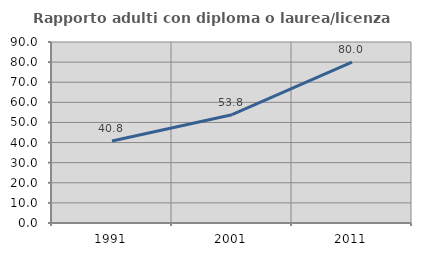
| Category | Rapporto adulti con diploma o laurea/licenza media  |
|---|---|
| 1991.0 | 40.816 |
| 2001.0 | 53.846 |
| 2011.0 | 80 |